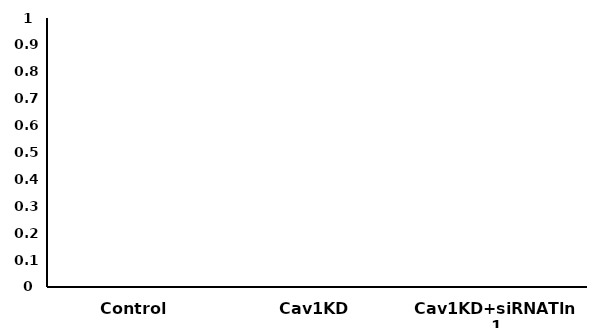
| Category | Series 0 |
|---|---|
| Control | 1 |
| Cav1KD | 1.262 |
| Cav1KD+siRNATln1 | 1.016 |